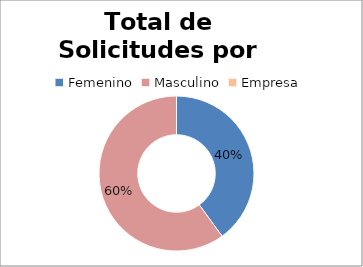
| Category | Series 0 |
|---|---|
| 0 | 2 |
| 1 | 3 |
| 2 | 0 |